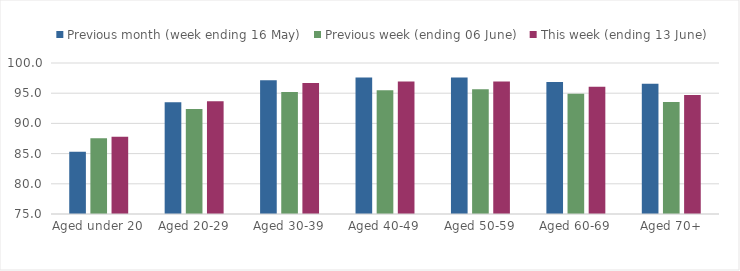
| Category | Previous month (week ending 16 May) | Previous week (ending 06 June) | This week (ending 13 June) |
|---|---|---|---|
| Aged under 20 | 85.318 | 87.532 | 87.791 |
| Aged 20-29 | 93.514 | 92.402 | 93.679 |
| Aged 30-39 | 97.128 | 95.217 | 96.699 |
| Aged 40-49 | 97.618 | 95.493 | 96.938 |
| Aged 50-59 | 97.603 | 95.653 | 96.926 |
| Aged 60-69 | 96.87 | 94.904 | 96.054 |
| Aged 70+ | 96.552 | 93.552 | 94.712 |